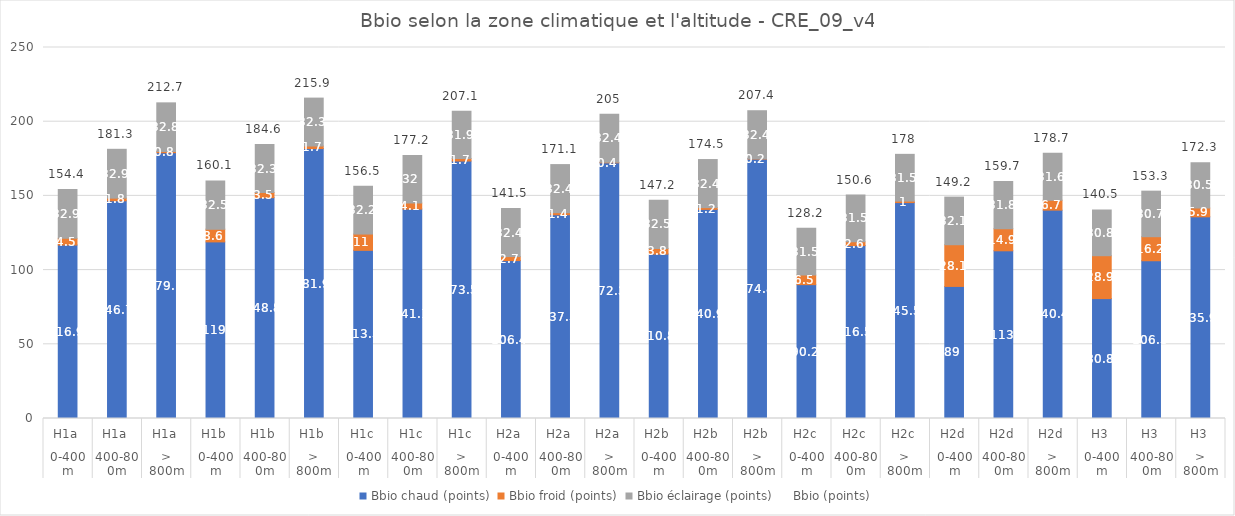
| Category | Bbio chaud (points) | Bbio froid (points) | Bbio éclairage (points) |
|---|---|---|---|
| 0 | 116.9 | 4.5 | 32.9 |
| 1 | 146.7 | 1.8 | 32.9 |
| 2 | 179.1 | 0.8 | 32.8 |
| 3 | 119 | 8.6 | 32.5 |
| 4 | 148.8 | 3.5 | 32.3 |
| 5 | 181.9 | 1.7 | 32.3 |
| 6 | 113.3 | 11 | 32.2 |
| 7 | 141.1 | 4.1 | 32 |
| 8 | 173.5 | 1.7 | 31.9 |
| 9 | 106.4 | 2.7 | 32.4 |
| 10 | 137.3 | 1.4 | 32.4 |
| 11 | 172.3 | 0.4 | 32.4 |
| 12 | 110.8 | 3.8 | 32.5 |
| 13 | 140.9 | 1.2 | 32.4 |
| 14 | 174.8 | 0.2 | 32.4 |
| 15 | 90.2 | 6.5 | 31.5 |
| 16 | 116.5 | 2.6 | 31.5 |
| 17 | 145.5 | 1 | 31.5 |
| 18 | 89 | 28.1 | 32.1 |
| 19 | 113 | 14.9 | 31.8 |
| 20 | 140.4 | 6.7 | 31.6 |
| 21 | 80.8 | 28.9 | 30.8 |
| 22 | 106.3 | 16.2 | 30.7 |
| 23 | 135.9 | 5.9 | 30.5 |